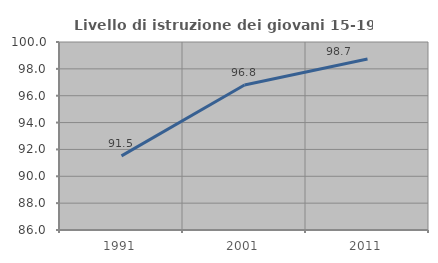
| Category | Livello di istruzione dei giovani 15-19 anni |
|---|---|
| 1991.0 | 91.52 |
| 2001.0 | 96.801 |
| 2011.0 | 98.738 |